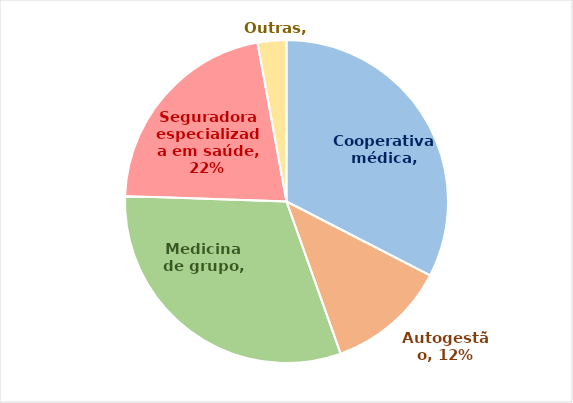
| Category | Series 0 |
|---|---|
| Cooperativa médica | 0.326 |
| Autogestão | 0.12 |
| Medicina de grupo | 0.31 |
| Seguradora especializada em saúde | 0.216 |
| Outras | 0.029 |